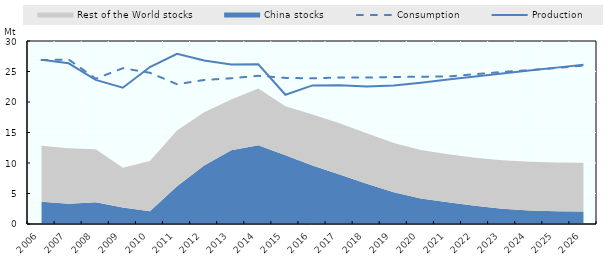
| Category | Production | Consumption |
|---|---|---|
| 2006.0 | 26.922 | 26.869 |
| 2007.0 | 26.347 | 26.97 |
| 2008.0 | 23.63 | 23.815 |
| 2009.0 | 22.344 | 25.539 |
| 2010.0 | 25.731 | 24.792 |
| 2011.0 | 27.895 | 22.917 |
| 2012.0 | 26.815 | 23.606 |
| 2013.0 | 26.166 | 23.892 |
| 2014.0 | 26.187 | 24.293 |
| 2015.0 | 21.189 | 23.954 |
| 2016.0 | 22.724 | 23.877 |
| 2017.0 | 22.739 | 24.02 |
| 2018.0 | 22.558 | 24.013 |
| 2019.0 | 22.711 | 24.102 |
| 2020.0 | 23.172 | 24.149 |
| 2021.0 | 23.684 | 24.176 |
| 2022.0 | 24.191 | 24.562 |
| 2023.0 | 24.684 | 24.931 |
| 2024.0 | 25.16 | 25.223 |
| 2025.0 | 25.635 | 25.571 |
| 2026.0 | 26.12 | 25.973 |